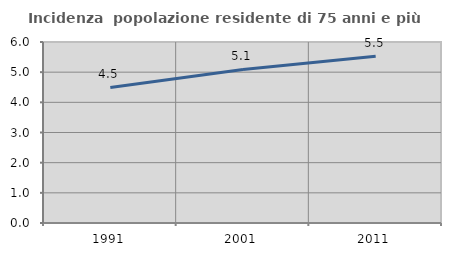
| Category | Incidenza  popolazione residente di 75 anni e più |
|---|---|
| 1991.0 | 4.492 |
| 2001.0 | 5.091 |
| 2011.0 | 5.525 |